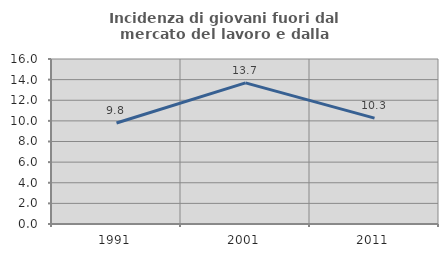
| Category | Incidenza di giovani fuori dal mercato del lavoro e dalla formazione  |
|---|---|
| 1991.0 | 9.789 |
| 2001.0 | 13.688 |
| 2011.0 | 10.266 |